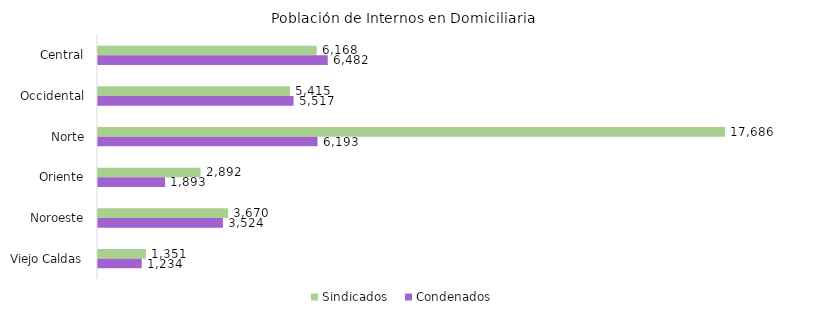
| Category | Sindicados | Condenados |
|---|---|---|
| Central | 6168 | 6482 |
| Occidental | 5415 | 5517 |
| Norte | 17686 | 6193 |
| Oriente | 2892 | 1893 |
| Noroeste | 3670 | 3524 |
| Viejo Caldas | 1351 | 1234 |